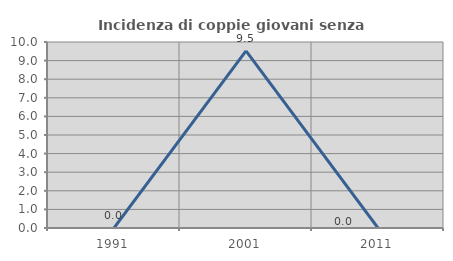
| Category | Incidenza di coppie giovani senza figli |
|---|---|
| 1991.0 | 0 |
| 2001.0 | 9.524 |
| 2011.0 | 0 |